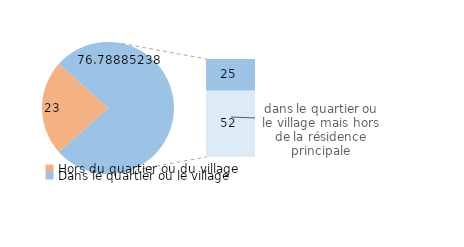
| Category | Series 0 |
|---|---|
| Hors du quartier ou du village | 23.211 |
| Ne sait pas/Refus | 0 |
| Dans le quartier ou le village | 24.899 |